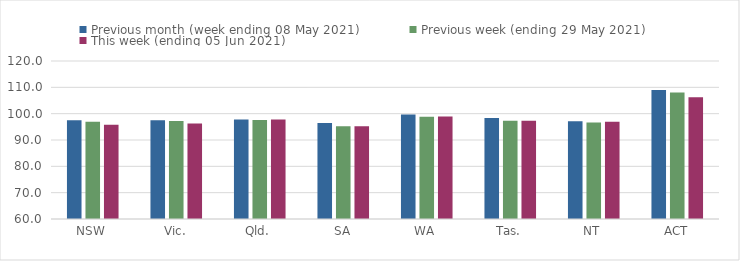
| Category | Previous month (week ending 08 May 2021) | Previous week (ending 29 May 2021) | This week (ending 05 Jun 2021) |
|---|---|---|---|
| NSW | 97.52 | 96.94 | 95.78 |
| Vic. | 97.5 | 97.19 | 96.29 |
| Qld. | 97.8 | 97.63 | 97.76 |
| SA | 96.45 | 95.23 | 95.23 |
| WA | 99.64 | 98.8 | 98.89 |
| Tas. | 98.4 | 97.3 | 97.31 |
| NT | 97.11 | 96.65 | 96.96 |
| ACT | 109.02 | 108.08 | 106.25 |